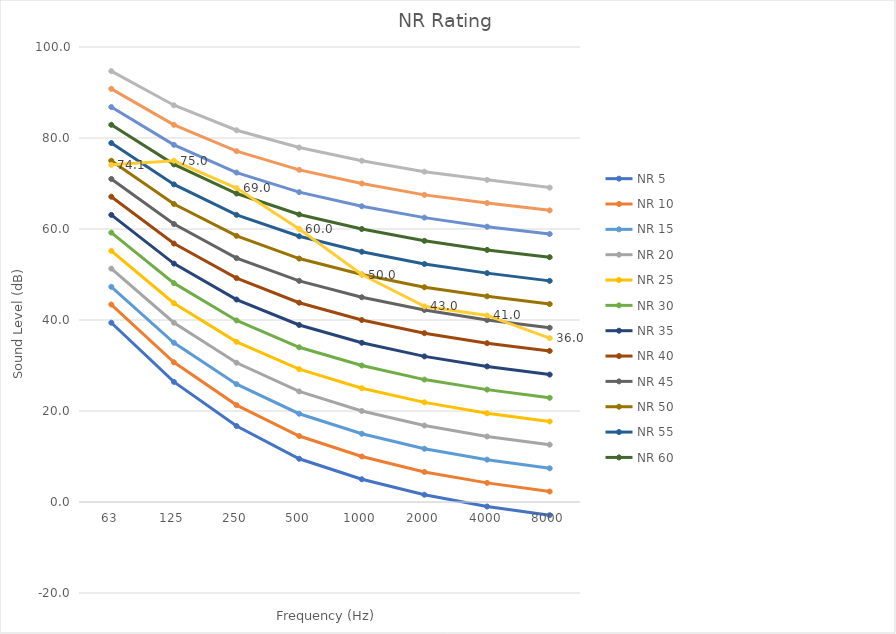
| Category | NR 5 | NR 10 | NR 15 | NR 20 | NR 25 | NR 30 | NR 35 | NR 40 | NR 45 | NR 50 | NR 55 | NR 60 | NR 65 | NR 70 | NR 75 | Input Sound Pressure Level at Octave Frequency |
|---|---|---|---|---|---|---|---|---|---|---|---|---|---|---|---|---|
| 63.0 | 39.4 | 43.4 | 47.3 | 51.3 | 55.2 | 59.2 | 63.1 | 67.1 | 71 | 75 | 78.9 | 82.9 | 86.8 | 90.8 | 94.7 | 74.1 |
| 125.0 | 26.4 | 30.7 | 35 | 39.4 | 43.7 | 48.1 | 52.4 | 56.8 | 61.1 | 65.5 | 69.8 | 74.2 | 78.5 | 82.9 | 87.2 | 75 |
| 250.0 | 16.7 | 21.3 | 25.9 | 30.6 | 35.2 | 39.9 | 44.5 | 49.2 | 53.6 | 58.5 | 63.1 | 67.8 | 72.4 | 77.1 | 81.7 | 69 |
| 500.0 | 9.5 | 14.5 | 19.4 | 24.3 | 29.2 | 34 | 38.9 | 43.8 | 48.6 | 53.5 | 58.4 | 63.2 | 68.1 | 73 | 77.9 | 60 |
| 1000.0 | 5 | 10 | 15 | 20 | 25 | 30 | 35 | 40 | 45 | 50 | 55 | 60 | 65 | 70 | 75 | 50 |
| 2000.0 | 1.6 | 6.6 | 11.7 | 16.8 | 21.9 | 26.9 | 32 | 37.1 | 42.2 | 47.2 | 52.3 | 57.4 | 62.5 | 67.5 | 72.6 | 43 |
| 4000.0 | -1 | 4.2 | 9.3 | 14.4 | 19.5 | 24.7 | 29.8 | 34.9 | 40 | 45.2 | 50.3 | 55.4 | 60.5 | 65.7 | 70.8 | 41 |
| 8000.0 | -2.9 | 2.3 | 7.4 | 12.6 | 17.7 | 22.9 | 28 | 33.2 | 38.3 | 43.5 | 48.6 | 53.8 | 58.9 | 64.1 | 69.1 | 36 |